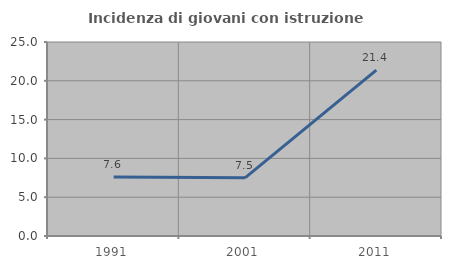
| Category | Incidenza di giovani con istruzione universitaria |
|---|---|
| 1991.0 | 7.599 |
| 2001.0 | 7.494 |
| 2011.0 | 21.37 |